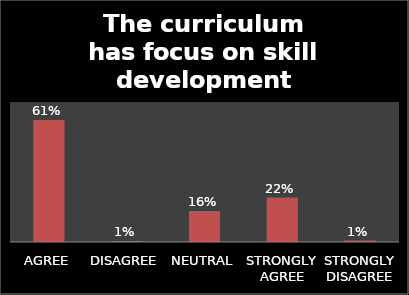
| Category | Series 0 |
|---|---|
| AGREE | 0.61 |
| DISAGREE | 0.005 |
| NEUTRAL | 0.155 |
| STRONGLY AGREE | 0.222 |
| STRONGLY DISAGREE | 0.008 |